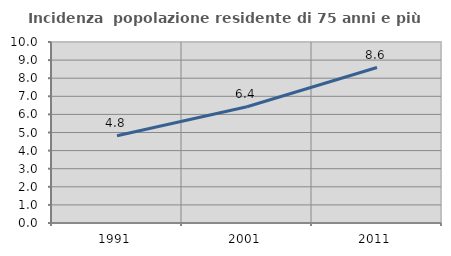
| Category | Incidenza  popolazione residente di 75 anni e più |
|---|---|
| 1991.0 | 4.819 |
| 2001.0 | 6.423 |
| 2011.0 | 8.588 |